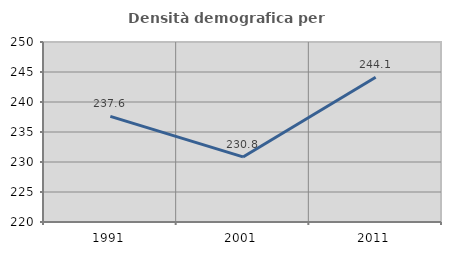
| Category | Densità demografica |
|---|---|
| 1991.0 | 237.61 |
| 2001.0 | 230.848 |
| 2011.0 | 244.117 |